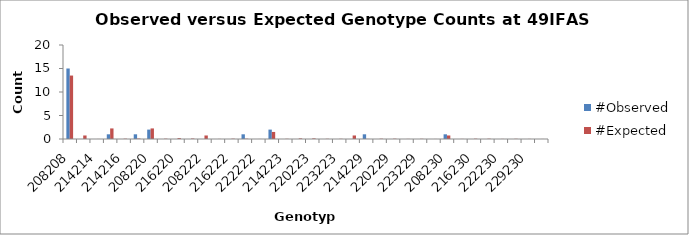
| Category | #Observed | #Expected |
|---|---|---|
| 208208.0 | 15 | 13.5 |
| 208214.0 | 0 | 0.75 |
| 214214.0 | 0 | 0.01 |
| 208216.0 | 1 | 2.25 |
| 214216.0 | 0 | 0.062 |
| 216216.0 | 1 | 0.094 |
| 208220.0 | 2 | 2.25 |
| 214220.0 | 0 | 0.062 |
| 216220.0 | 0 | 0.188 |
| 220220.0 | 0 | 0.094 |
| 208222.0 | 0 | 0.75 |
| 214222.0 | 0 | 0.021 |
| 216222.0 | 0 | 0.062 |
| 220222.0 | 1 | 0.062 |
| 222222.0 | 0 | 0.01 |
| 208223.0 | 2 | 1.5 |
| 214223.0 | 0 | 0.042 |
| 216223.0 | 0 | 0.125 |
| 220223.0 | 0 | 0.125 |
| 222223.0 | 0 | 0.042 |
| 223223.0 | 0 | 0.042 |
| 208229.0 | 0 | 0.75 |
| 214229.0 | 1 | 0.021 |
| 216229.0 | 0 | 0.062 |
| 220229.0 | 0 | 0.062 |
| 222229.0 | 0 | 0.021 |
| 223229.0 | 0 | 0.042 |
| 229229.0 | 0 | 0.01 |
| 208230.0 | 1 | 0.75 |
| 214230.0 | 0 | 0.021 |
| 216230.0 | 0 | 0.062 |
| 220230.0 | 0 | 0.062 |
| 222230.0 | 0 | 0.021 |
| 223230.0 | 0 | 0.042 |
| 229230.0 | 0 | 0.021 |
| 230230.0 | 0 | 0.01 |